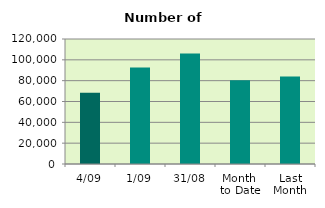
| Category | Series 0 |
|---|---|
| 4/09 | 68372 |
| 1/09 | 92598 |
| 31/08 | 106128 |
| Month 
to Date | 80485 |
| Last
Month | 83988.522 |